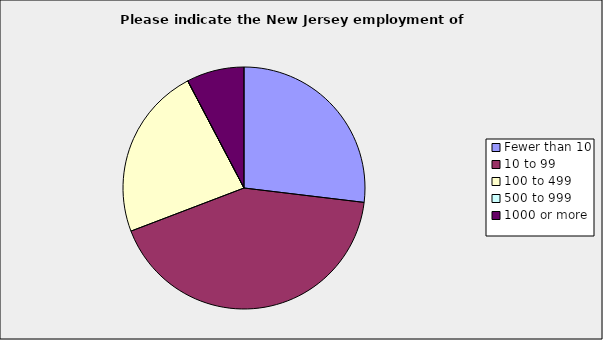
| Category | Series 0 |
|---|---|
| Fewer than 10 | 0.269 |
| 10 to 99 | 0.423 |
| 100 to 499 | 0.231 |
| 500 to 999 | 0 |
| 1000 or more | 0.077 |